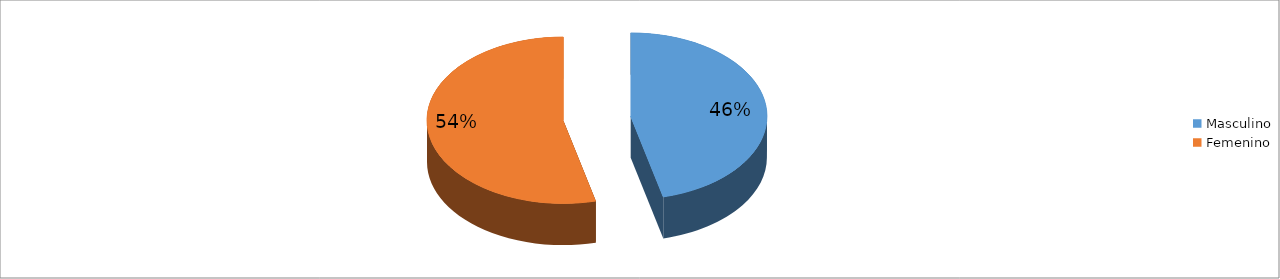
| Category | Series 0 |
|---|---|
| Masculino | 0.462 |
| Femenino | 0.538 |